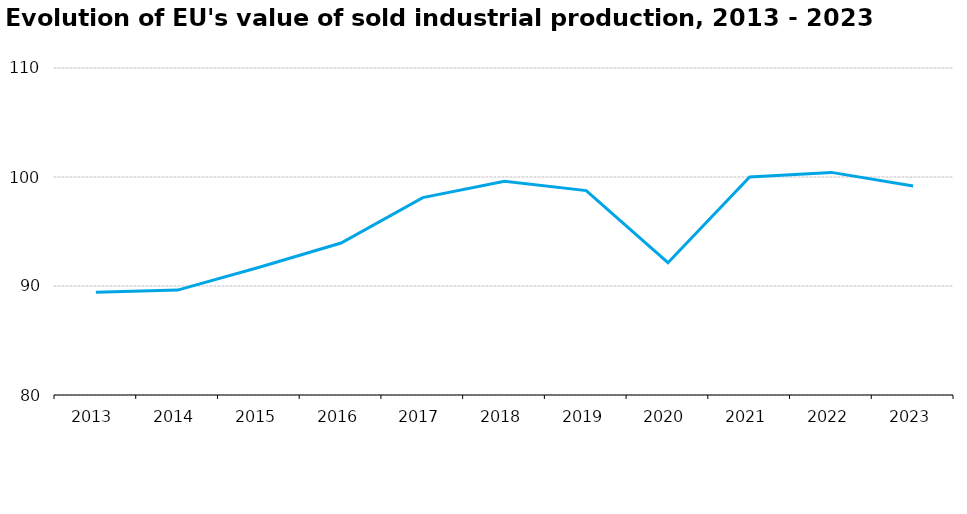
| Category | index (base=2021) |
|---|---|
| 2013.0 | 89.43 |
| 2014.0 | 89.622 |
| 2015.0 | 91.716 |
| 2016.0 | 93.945 |
| 2017.0 | 98.108 |
| 2018.0 | 99.617 |
| 2019.0 | 98.755 |
| 2020.0 | 92.137 |
| 2021.0 | 100 |
| 2022.0 | 100.424 |
| 2023.0 | 99.176 |